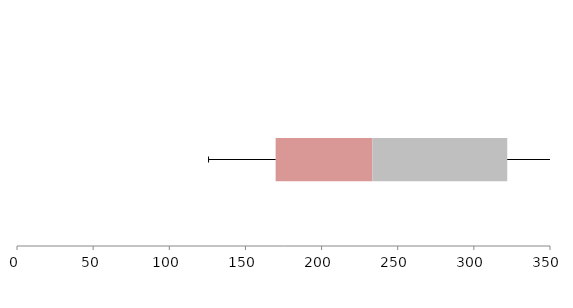
| Category | Series 1 | Series 2 | Series 3 |
|---|---|---|---|
| 0 | 169.839 | 63.548 | 88.537 |